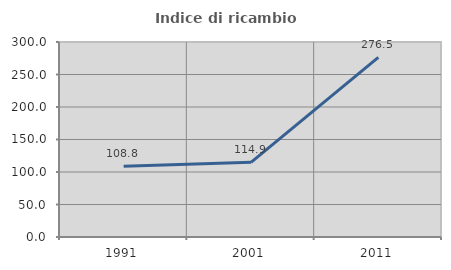
| Category | Indice di ricambio occupazionale  |
|---|---|
| 1991.0 | 108.791 |
| 2001.0 | 114.894 |
| 2011.0 | 276.471 |